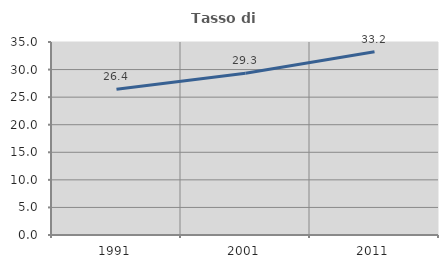
| Category | Tasso di occupazione   |
|---|---|
| 1991.0 | 26.415 |
| 2001.0 | 29.32 |
| 2011.0 | 33.215 |